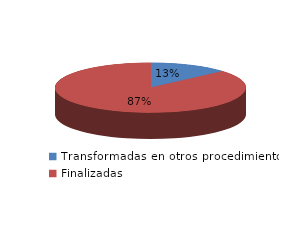
| Category | Series 0 |
|---|---|
| Transformadas en otros procedimientos | 375 |
| Finalizadas | 2424 |